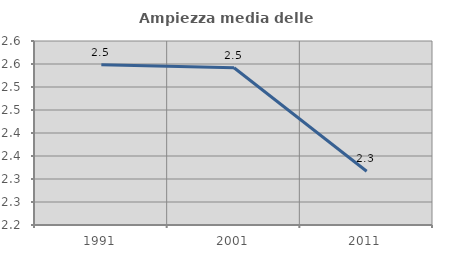
| Category | Ampiezza media delle famiglie |
|---|---|
| 1991.0 | 2.549 |
| 2001.0 | 2.542 |
| 2011.0 | 2.317 |